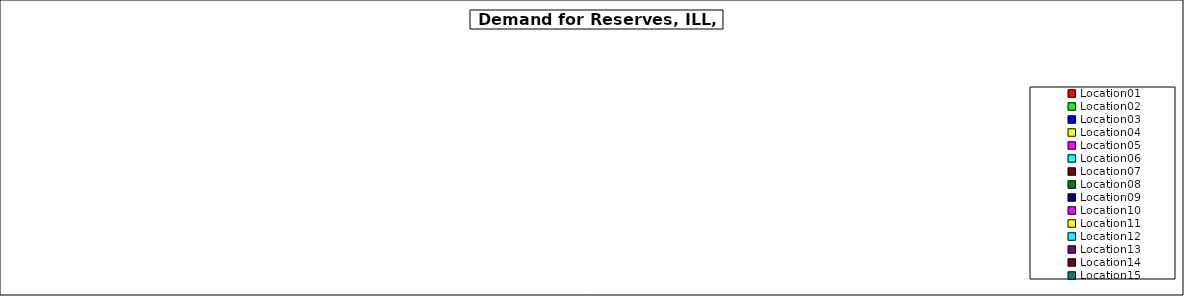
| Category | Series 0 |
|---|---|
| Location01 | 0 |
| Location02 | 0 |
| Location03 | 0 |
| Location04 | 0 |
| Location05 | 0 |
| Location06 | 0 |
| Location07 | 0 |
| Location08 | 0 |
| Location09 | 0 |
| Location10 | 0 |
| Location11 | 0 |
| Location12 | 0 |
| Location13 | 0 |
| Location14 | 0 |
| Location15 | 0 |